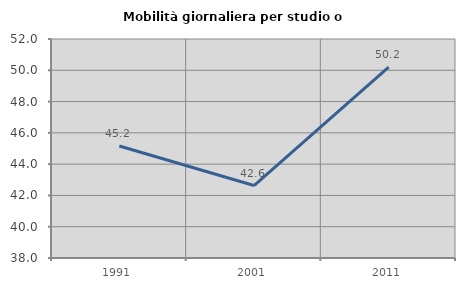
| Category | Mobilità giornaliera per studio o lavoro |
|---|---|
| 1991.0 | 45.161 |
| 2001.0 | 42.635 |
| 2011.0 | 50.201 |